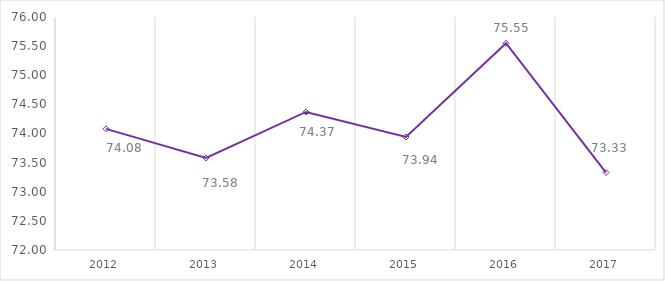
| Category | Series 0 |
|---|---|
| 2012.0 | 74.08 |
| 2013.0 | 73.58 |
| 2014.0 | 74.37 |
| 2015.0 | 73.94 |
| 2016.0 | 75.55 |
| 2017.0 | 73.33 |